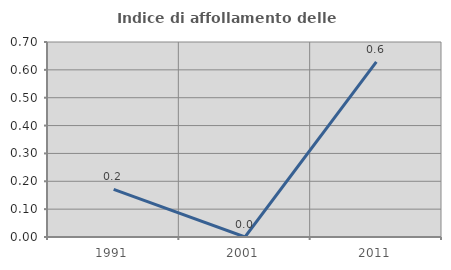
| Category | Indice di affollamento delle abitazioni  |
|---|---|
| 1991.0 | 0.171 |
| 2001.0 | 0 |
| 2011.0 | 0.629 |